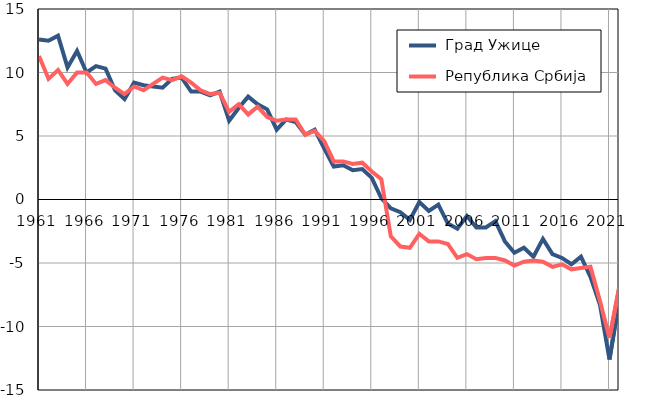
| Category |  Град Ужице |  Република Србија |
|---|---|---|
| 1961.0 | 12.6 | 11.3 |
| 1962.0 | 12.5 | 9.5 |
| 1963.0 | 12.9 | 10.2 |
| 1964.0 | 10.4 | 9.1 |
| 1965.0 | 11.7 | 10 |
| 1966.0 | 10 | 10 |
| 1967.0 | 10.5 | 9.1 |
| 1968.0 | 10.3 | 9.4 |
| 1969.0 | 8.6 | 8.8 |
| 1970.0 | 7.9 | 8.3 |
| 1971.0 | 9.2 | 8.9 |
| 1972.0 | 9 | 8.6 |
| 1973.0 | 8.9 | 9.1 |
| 1974.0 | 8.8 | 9.6 |
| 1975.0 | 9.5 | 9.4 |
| 1976.0 | 9.6 | 9.7 |
| 1977.0 | 8.5 | 9.2 |
| 1978.0 | 8.5 | 8.6 |
| 1979.0 | 8.2 | 8.3 |
| 1980.0 | 8.5 | 8.4 |
| 1981.0 | 6.2 | 6.9 |
| 1982.0 | 7.2 | 7.5 |
| 1983.0 | 8.1 | 6.7 |
| 1984.0 | 7.5 | 7.3 |
| 1985.0 | 7.1 | 6.5 |
| 1986.0 | 5.5 | 6.2 |
| 1987.0 | 6.3 | 6.3 |
| 1988.0 | 6.1 | 6.3 |
| 1989.0 | 5.1 | 5.1 |
| 1990.0 | 5.5 | 5.4 |
| 1991.0 | 4 | 4.6 |
| 1992.0 | 2.6 | 3 |
| 1993.0 | 2.7 | 3 |
| 1994.0 | 2.3 | 2.8 |
| 1995.0 | 2.4 | 2.9 |
| 1996.0 | 1.7 | 2.2 |
| 1997.0 | 0.1 | 1.6 |
| 1998.0 | -0.7 | -2.9 |
| 1999.0 | -1 | -3.7 |
| 2000.0 | -1.6 | -3.8 |
| 2001.0 | -0.2 | -2.7 |
| 2002.0 | -0.9 | -3.3 |
| 2003.0 | -0.4 | -3.3 |
| 2004.0 | -1.9 | -3.5 |
| 2005.0 | -2.3 | -4.6 |
| 2006.0 | -1.3 | -4.3 |
| 2007.0 | -2.2 | -4.7 |
| 2008.0 | -2.2 | -4.6 |
| 2009.0 | -1.7 | -4.6 |
| 2010.0 | -3.3 | -4.8 |
| 2011.0 | -4.2 | -5.2 |
| 2012.0 | -3.8 | -4.9 |
| 2013.0 | -4.5 | -4.8 |
| 2014.0 | -3.1 | -4.9 |
| 2015.0 | -4.3 | -5.3 |
| 2016.0 | -4.6 | -5.1 |
| 2017.0 | -5.1 | -5.5 |
| 2018.0 | -4.5 | -5.4 |
| 2019.0 | -6.1 | -5.3 |
| 2020.0 | -8.3 | -8 |
| 2021.0 | -12.6 | -10.9 |
| 2022.0 | -8 | -7 |